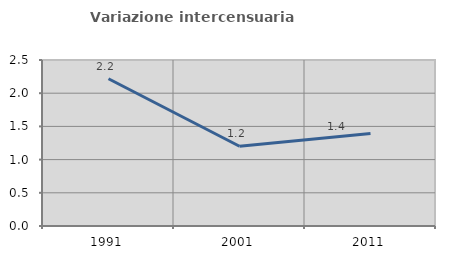
| Category | Variazione intercensuaria annua |
|---|---|
| 1991.0 | 2.217 |
| 2001.0 | 1.202 |
| 2011.0 | 1.393 |